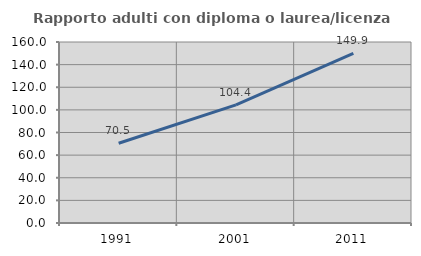
| Category | Rapporto adulti con diploma o laurea/licenza media  |
|---|---|
| 1991.0 | 70.536 |
| 2001.0 | 104.427 |
| 2011.0 | 149.903 |